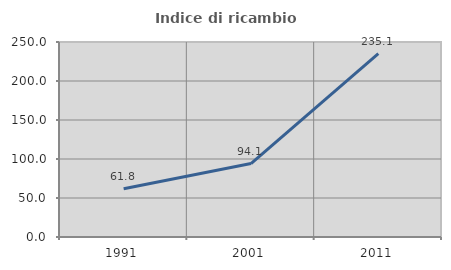
| Category | Indice di ricambio occupazionale  |
|---|---|
| 1991.0 | 61.815 |
| 2001.0 | 94.128 |
| 2011.0 | 235.096 |